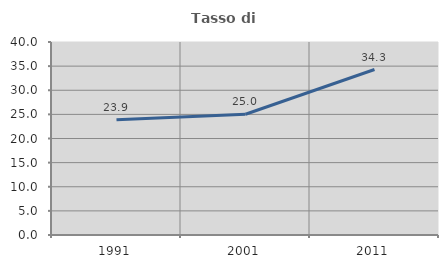
| Category | Tasso di occupazione   |
|---|---|
| 1991.0 | 23.865 |
| 2001.0 | 25.023 |
| 2011.0 | 34.298 |